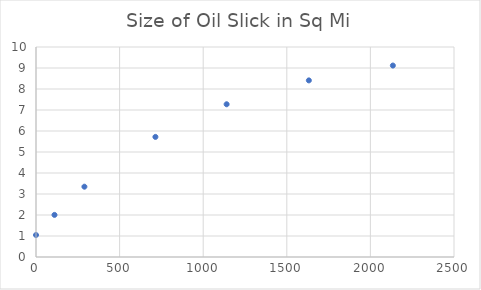
| Category | Series 0 |
|---|---|
| 0.0 | 1.047 |
| 110.557 | 2.005 |
| 289.541 | 3.348 |
| 714.235 | 5.719 |
| 1140.1 | 7.273 |
| 1631.87 | 8.41 |
| 2134.35 | 9.117 |